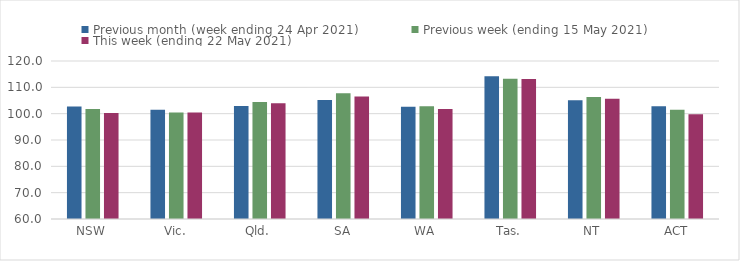
| Category | Previous month (week ending 24 Apr 2021) | Previous week (ending 15 May 2021) | This week (ending 22 May 2021) |
|---|---|---|---|
| NSW | 102.73 | 101.75 | 100.3 |
| Vic. | 101.53 | 100.47 | 100.4 |
| Qld. | 102.88 | 104.39 | 103.99 |
| SA | 105.16 | 107.72 | 106.51 |
| WA | 102.66 | 102.83 | 101.81 |
| Tas. | 114.19 | 113.28 | 113.16 |
| NT | 105.13 | 106.29 | 105.69 |
| ACT | 102.83 | 101.48 | 99.75 |